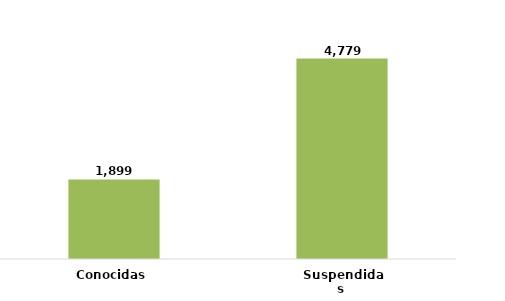
| Category | Series 0 |
|---|---|
| Conocidas  | 0.284 |
| Suspendidas  | 0.716 |